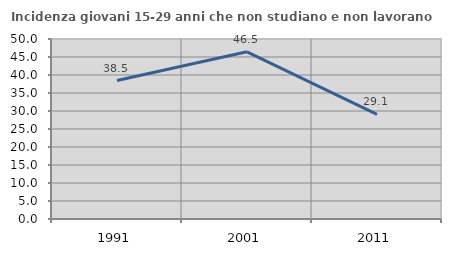
| Category | Incidenza giovani 15-29 anni che non studiano e non lavorano  |
|---|---|
| 1991.0 | 38.469 |
| 2001.0 | 46.452 |
| 2011.0 | 29.078 |